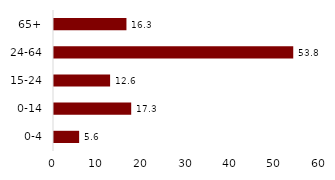
| Category | Series 0 |
|---|---|
| 0-4 | 5.649 |
| 0-14 | 17.349 |
| 15-24 | 12.607 |
| 24-64 | 53.764 |
| 65+ | 16.28 |